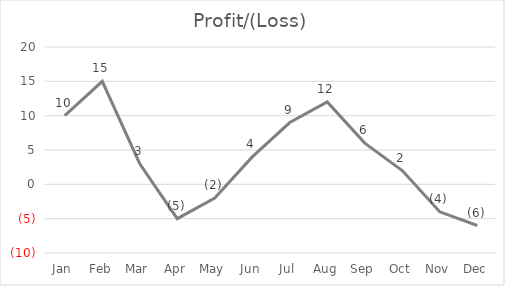
| Category | Profit/(Loss) |
|---|---|
| Jan | 10 |
| Feb | 15 |
| Mar | 3 |
| Apr | -5 |
| May | -2 |
| Jun | 4 |
| Jul | 9 |
| Aug | 12 |
| Sep | 6 |
| Oct | 2 |
| Nov | -4 |
| Dec | -6 |